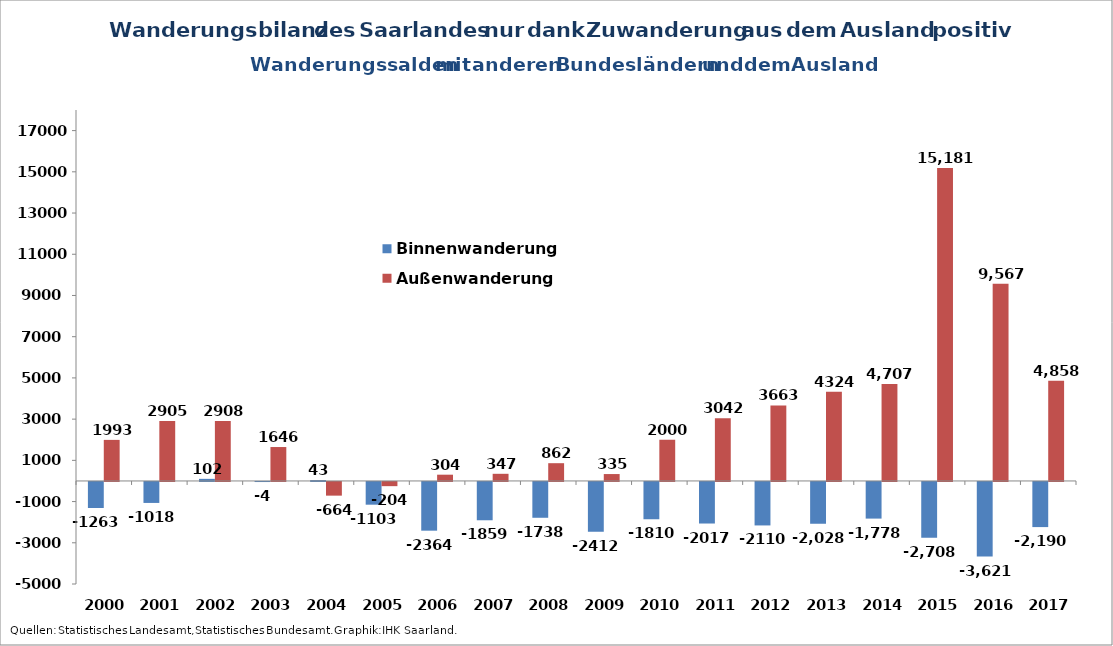
| Category | Binnenwanderung | Außenwanderung |
|---|---|---|
| 2000.0 | -1263 | 1993 |
| 2001.0 | -1018 | 2905 |
| 2002.0 | 102 | 2908 |
| 2003.0 | -4 | 1646 |
| 2004.0 | 43 | -664 |
| 2005.0 | -1103 | -204 |
| 2006.0 | -2364 | 304 |
| 2007.0 | -1859 | 347 |
| 2008.0 | -1738 | 862 |
| 2009.0 | -2412 | 335 |
| 2010.0 | -1810 | 2000 |
| 2011.0 | -2017 | 3042 |
| 2012.0 | -2110 | 3663 |
| 2013.0 | -2028 | 4324 |
| 2014.0 | -1778 | 4707 |
| 2015.0 | -2708 | 15181 |
| 2016.0 | -3621 | 9567 |
| 2017.0 | -2190 | 4858 |